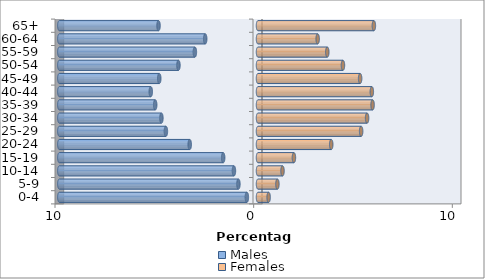
| Category | Males | Females |
|---|---|---|
| 0-4 | -0.561 | 0.535 |
| 5-9 | -0.986 | 0.977 |
| 10-14 | -1.211 | 1.233 |
| 15-19 | -1.753 | 1.808 |
| 20-24 | -3.437 | 3.687 |
| 25-29 | -4.637 | 5.192 |
| 30-34 | -4.863 | 5.491 |
| 35-39 | -5.175 | 5.768 |
| 40-44 | -5.398 | 5.73 |
| 45-49 | -4.971 | 5.141 |
| 50-54 | -4.005 | 4.276 |
| 55-59 | -3.178 | 3.488 |
| 60-64 | -2.657 | 3.003 |
| 65+ | -5.008 | 5.833 |